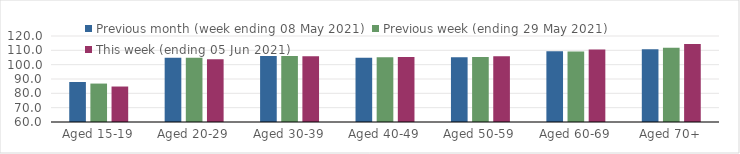
| Category | Previous month (week ending 08 May 2021) | Previous week (ending 29 May 2021) | This week (ending 05 Jun 2021) |
|---|---|---|---|
| Aged 15-19 | 87.91 | 86.81 | 84.75 |
| Aged 20-29 | 104.85 | 104.82 | 103.77 |
| Aged 30-39 | 105.96 | 106.1 | 105.82 |
| Aged 40-49 | 104.9 | 105.22 | 105.38 |
| Aged 50-59 | 105.17 | 105.34 | 105.83 |
| Aged 60-69 | 109.3 | 109.17 | 110.59 |
| Aged 70+ | 110.81 | 111.8 | 114.44 |